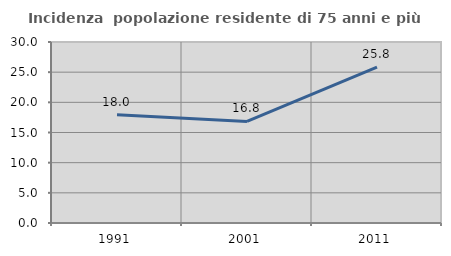
| Category | Incidenza  popolazione residente di 75 anni e più |
|---|---|
| 1991.0 | 17.958 |
| 2001.0 | 16.827 |
| 2011.0 | 25.817 |